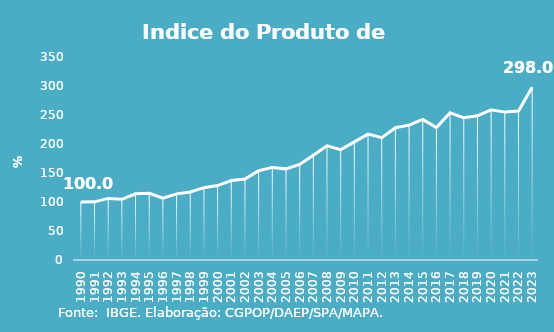
| Category | Indice de Prod. base 1990 |
|---|---|
| 1990.0 | 100 |
| 1991.0 | 100.275 |
| 1992.0 | 106.203 |
| 1993.0 | 104.57 |
| 1994.0 | 114.164 |
| 1995.0 | 115.024 |
| 1996.0 | 106.552 |
| 1997.0 | 114.037 |
| 1998.0 | 117.319 |
| 1999.0 | 124.734 |
| 2000.0 | 128.293 |
| 2001.0 | 136.975 |
| 2002.0 | 139.51 |
| 2003.0 | 153.868 |
| 2004.0 | 159.641 |
| 2005.0 | 157.136 |
| 2006.0 | 164.858 |
| 2007.0 | 180.781 |
| 2008.0 | 196.91 |
| 2009.0 | 190.309 |
| 2010.0 | 203.581 |
| 2011.0 | 217.041 |
| 2012.0 | 210.932 |
| 2013.0 | 228.009 |
| 2014.0 | 232.562 |
| 2015.0 | 242.318 |
| 2016.0 | 228.239 |
| 2017.0 | 253.826 |
| 2018.0 | 245.134 |
| 2019.0 | 248.619 |
| 2020.0 | 258.848 |
| 2021.0 | 254.988 |
| 2022.0 | 256.904 |
| 2023.0 | 298.015 |